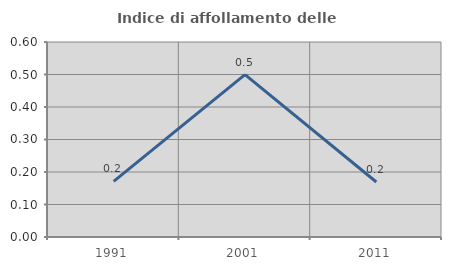
| Category | Indice di affollamento delle abitazioni  |
|---|---|
| 1991.0 | 0.171 |
| 2001.0 | 0.499 |
| 2011.0 | 0.169 |